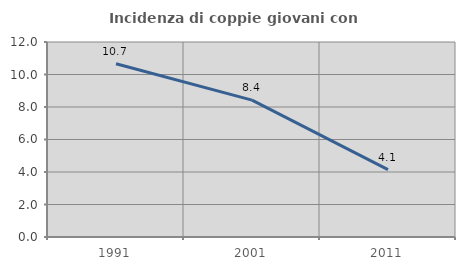
| Category | Incidenza di coppie giovani con figli |
|---|---|
| 1991.0 | 10.658 |
| 2001.0 | 8.425 |
| 2011.0 | 4.149 |